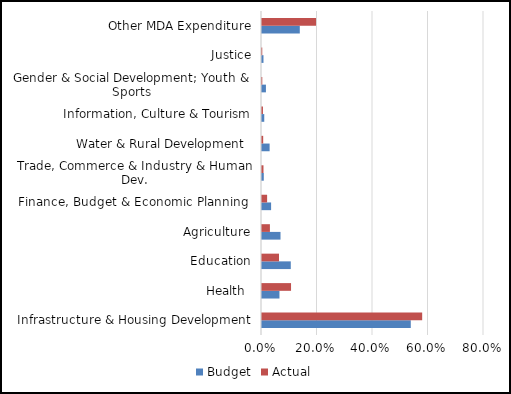
| Category | Budget | Actual |
|---|---|---|
| Infrastructure & Housing Development | 0.536 | 0.577 |
| Health  | 0.063 | 0.105 |
| Education | 0.104 | 0.061 |
| Agriculture | 0.067 | 0.029 |
| Finance, Budget & Economic Planning  | 0.033 | 0.018 |
| Trade, Commerce & Industry & Human Dev. | 0.006 | 0.005 |
| Water & Rural Development  | 0.027 | 0.004 |
| Information, Culture & Tourism | 0.008 | 0.003 |
| Gender & Social Development; Youth & Sports | 0.014 | 0.001 |
| Justice | 0.005 | 0.001 |
| Other MDA Expenditure | 0.136 | 0.195 |